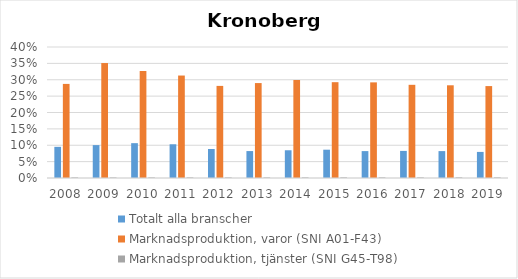
| Category | Totalt alla branscher | Marknadsproduktion, varor (SNI A01-F43) | Marknadsproduktion, tjänster (SNI G45-T98) |
|---|---|---|---|
| 2008 | 0.095 | 0.287 | 0.002 |
| 2009 | 0.1 | 0.351 | 0.002 |
| 2010 | 0.106 | 0.327 | 0.002 |
| 2011 | 0.103 | 0.313 | 0.002 |
| 2012 | 0.089 | 0.281 | 0.002 |
| 2013 | 0.082 | 0.29 | 0.002 |
| 2014 | 0.085 | 0.299 | 0.002 |
| 2015 | 0.086 | 0.293 | 0.002 |
| 2016 | 0.082 | 0.292 | 0.002 |
| 2017 | 0.083 | 0.285 | 0.002 |
| 2018 | 0.082 | 0.283 | 0.002 |
| 2019 | 0.08 | 0.281 | 0.002 |